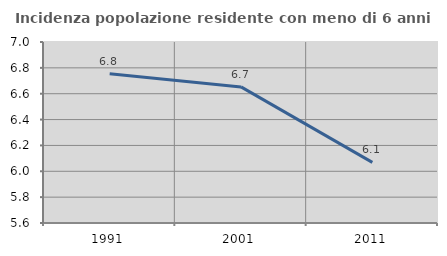
| Category | Incidenza popolazione residente con meno di 6 anni |
|---|---|
| 1991.0 | 6.754 |
| 2001.0 | 6.653 |
| 2011.0 | 6.069 |